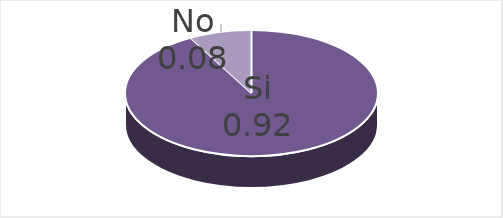
| Category | Series 0 |
|---|---|
| Si | 23 |
| No | 2 |